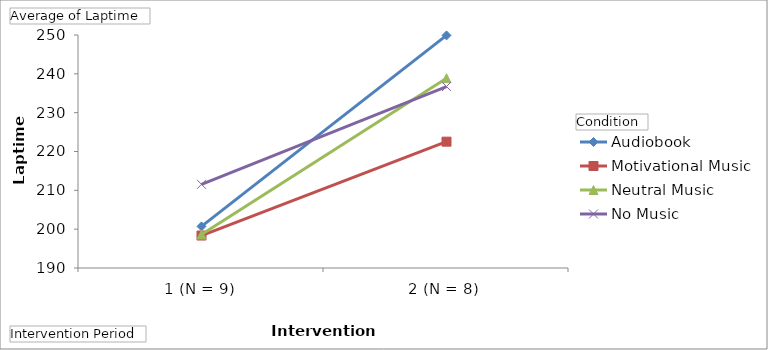
| Category | Audiobook | Motivational Music | Neutral Music | No Music |
|---|---|---|---|---|
| 1 (N = 9) | 200.712 | 198.361 | 198.613 | 211.543 |
| 2 (N = 8) | 249.888 | 222.531 | 238.88 | 236.729 |